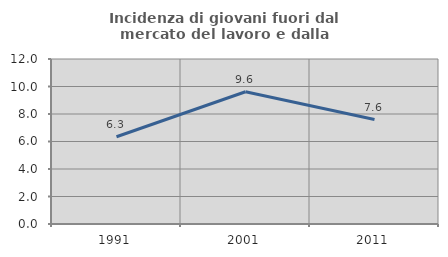
| Category | Incidenza di giovani fuori dal mercato del lavoro e dalla formazione  |
|---|---|
| 1991.0 | 6.343 |
| 2001.0 | 9.618 |
| 2011.0 | 7.595 |